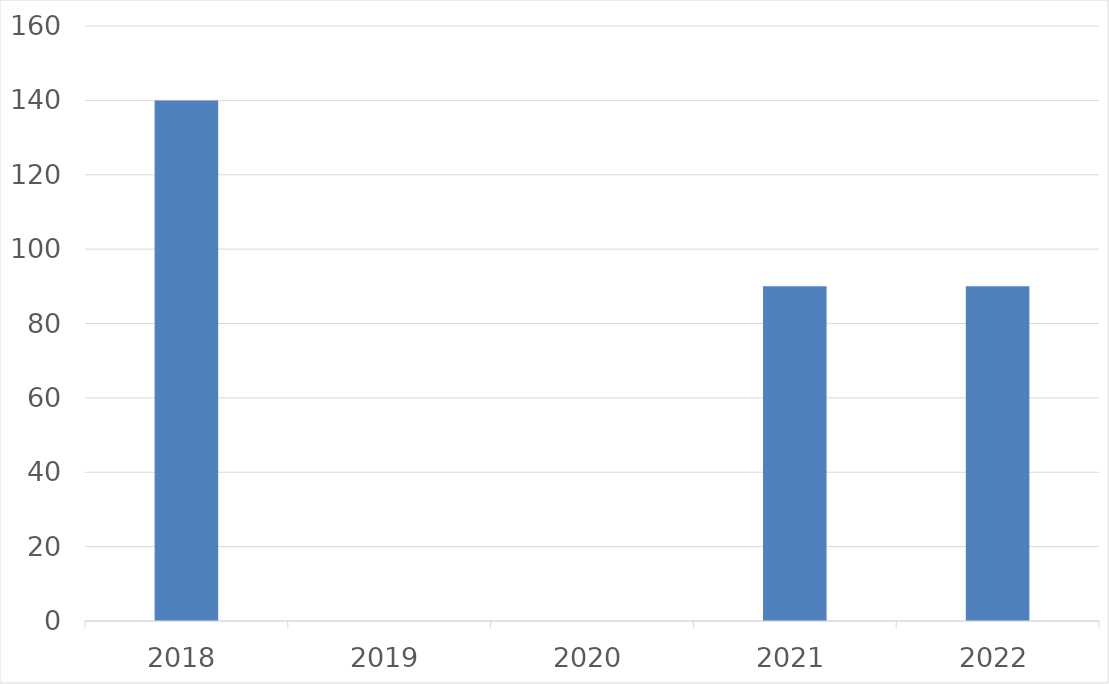
| Category | Series 0 |
|---|---|
| 2018 | 140 |
| 2019 | 0 |
| 2020 | 0 |
| 2021 | 90 |
| 2022 | 90 |